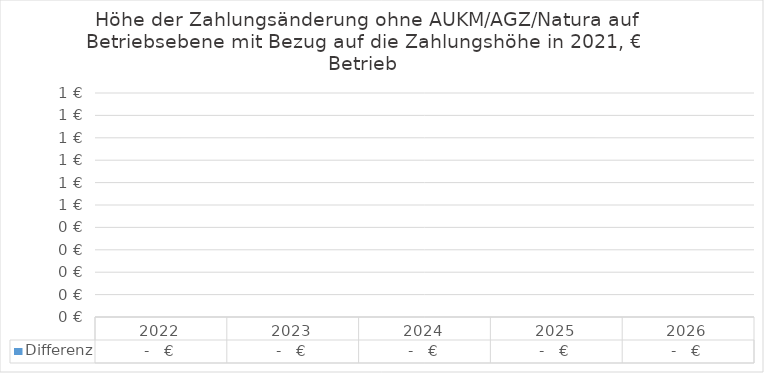
| Category | Differenz |
|---|---|
| 2022.0 | 0 |
| 2023.0 | 0 |
| 2024.0 | 0 |
| 2025.0 | 0 |
| 2026.0 | 0 |